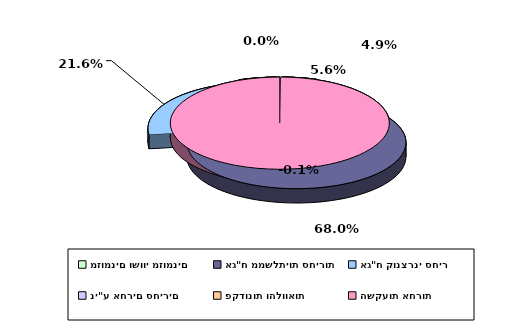
| Category | Series 0 |
|---|---|
| מזומנים ושווי מזומנים | 0.049 |
| אג"ח ממשלתיות סחירות | 0.68 |
| אג"ח קונצרני סחיר | 0.216 |
| ני"ע אחרים סחירים | 0.056 |
| פקדונות והלוואות | 0 |
| השקעות אחרות | -0.001 |